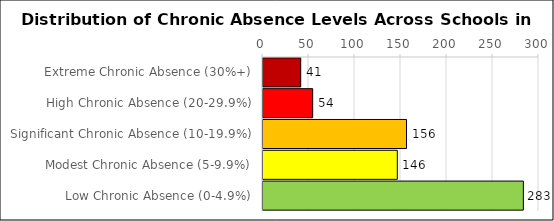
| Category | Number of Schools |
|---|---|
| Extreme Chronic Absence (30%+) | 41 |
| High Chronic Absence (20-29.9%) | 54 |
| Significant Chronic Absence (10-19.9%) | 156 |
| Modest Chronic Absence (5-9.9%) | 146 |
| Low Chronic Absence (0-4.9%) | 283 |